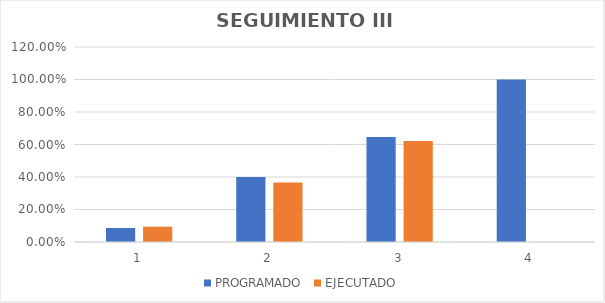
| Category | PROGRAMADO | EJECUTADO |
|---|---|---|
| 0 | 0.086 | 0.094 |
| 1 | 0.4 | 0.366 |
| 2 | 0.647 | 0.621 |
| 3 | 1 | 0 |